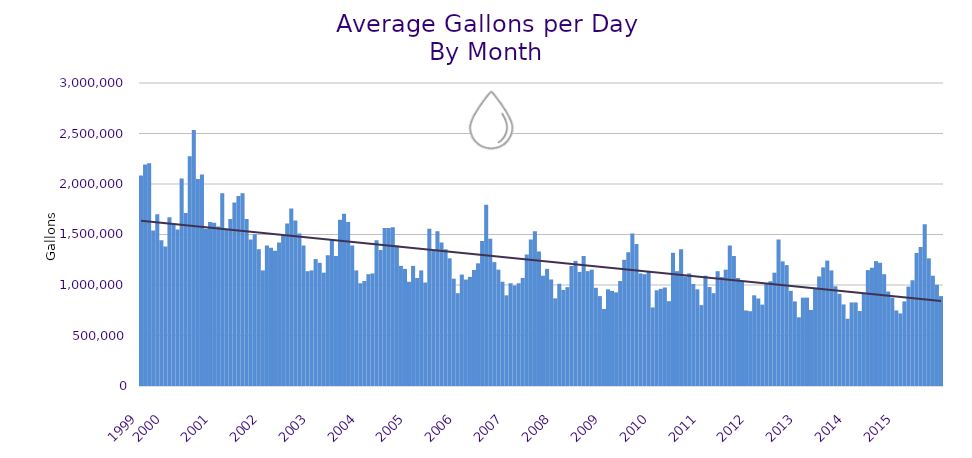
| Category | Series 0 |
|---|---|
| 1999.0 | 2083059.677 |
| nan | 2193643.161 |
| nan | 2206396.3 |
| nan | 1539362.581 |
| nan | 1699794.167 |
| nan | 1441848.323 |
| 2000.0 | 1381607.161 |
| nan | 1671325.214 |
| nan | 1605326.129 |
| nan | 1550398.467 |
| nan | 2055473.161 |
| nan | 1712920 |
| nan | 2273920 |
| nan | 2535720 |
| nan | 2049520 |
| nan | 2094400 |
| nan | 1555840 |
| nan | 1623160 |
| 2001.0 | 1615680 |
| nan | 1578280 |
| nan | 1907400 |
| nan | 1555840 |
| nan | 1653080 |
| nan | 1817640 |
| nan | 1880808.419 |
| nan | 1907400 |
| nan | 1653080 |
| nan | 1451120 |
| nan | 1503480 |
| nan | 1353880 |
| 2002.0 | 1144440 |
| nan | 1391280 |
| nan | 1368840 |
| nan | 1338920 |
| nan | 1421200 |
| nan | 1496000 |
| nan | 1608200 |
| nan | 1757800 |
| nan | 1638120 |
| nan | 1510960 |
| nan | 1391280 |
| nan | 1136960 |
| 2003.0 | 1144440 |
| nan | 1256640 |
| nan | 1219240 |
| nan | 1122000 |
| nan | 1294040 |
| nan | 1443640 |
| nan | 1286560 |
| nan | 1645600 |
| nan | 1705440 |
| nan | 1623160 |
| nan | 1391280 |
| nan | 1144440 |
| 2004.0 | 1017280 |
| nan | 1039720 |
| nan | 1107040 |
| nan | 1114520 |
| nan | 1443640 |
| nan | 1346400 |
| nan | 1563320 |
| nan | 1563320 |
| nan | 1570800 |
| nan | 1391280 |
| nan | 1189320 |
| nan | 1159400 |
| 2005.0 | 1032240 |
| nan | 1189320 |
| nan | 1069640 |
| nan | 1144440 |
| nan | 1024760 |
| nan | 1555840 |
| nan | 1338920 |
| nan | 1533400 |
| nan | 1421200 |
| nan | 1353880 |
| nan | 1264120 |
| nan | 1062160 |
| 2006.0 | 918712.194 |
| nan | 1103155.536 |
| nan | 1053757.452 |
| nan | 1080438.5 |
| nan | 1148463.71 |
| nan | 1214446 |
| nan | 1436160 |
| nan | 1795200 |
| nan | 1458600 |
| nan | 1226720 |
| nan | 1151920 |
| nan | 1032240 |
| 2007.0 | 897600 |
| nan | 1017280 |
| nan | 994840 |
| nan | 1017280 |
| nan | 1069640 |
| nan | 1301520 |
| nan | 1451120 |
| nan | 1533400 |
| nan | 1331440 |
| nan | 1092080 |
| nan | 1159400 |
| nan | 1054680 |
| 2008.0 | 867680 |
| nan | 1012531.5 |
| nan | 951152.129 |
| nan | 978536.8 |
| nan | 1188344.032 |
| nan | 1238728.733 |
| nan | 1129480 |
| nan | 1286560 |
| nan | 1136960 |
| nan | 1151920 |
| nan | 972400 |
| nan | 890120 |
| 2009.0 | 762960 |
| nan | 957440 |
| nan | 942480 |
| nan | 927520 |
| nan | 1039720 |
| nan | 1249160 |
| nan | 1323960 |
| nan | 1510960 |
| nan | 1406240 |
| nan | 1114520 |
| nan | 1107040 |
| nan | 1129480 |
| 2010.0 | 777920 |
| nan | 947745.25 |
| nan | 961719.161 |
| nan | 975173.833 |
| nan | 839375.806 |
| nan | 1320121.233 |
| nan | 1136960 |
| nan | 1353880 |
| nan | 1084600 |
| nan | 1114520 |
| nan | 1009800 |
| nan | 957440 |
| 2011.0 | 800360 |
| nan | 1092080 |
| nan | 979880 |
| nan | 919316.129 |
| nan | 1136960 |
| nan | 1078567.742 |
| nan | 1151920 |
| nan | 1391280 |
| nan | 1286560 |
| nan | 1069640 |
| nan | 1032240 |
| nan | 748000 |
| 2012.0 | 740520 |
| nan | 898004.612 |
| nan | 866524 |
| nan | 805719.677 |
| nan | 1012979 |
| nan | 1036854.677 |
| nan | 1122000 |
| nan | 1451120 |
| nan | 1234200 |
| nan | 1196800 |
| nan | 942480 |
| nan | 837760 |
| 2013.0 | 680680 |
| nan | 875160 |
| nan | 875160 |
| nan | 752825.806 |
| nan | 972400 |
| nan | 1084600 |
| nan | 1174360 |
| nan | 1241680 |
| nan | 1144440 |
| nan | 987360 |
| nan | 912560 |
| nan | 807840 |
| 2014.0 | 665720 |
| nan | 827341 |
| nan | 827106 |
| nan | 742463 |
| nan | 921589 |
| nan | 1147621 |
| nan | 1170725 |
| nan | 1236586 |
| nan | 1220152 |
| nan | 1107040 |
| nan | 935000 |
| nan | 875160 |
| 2015.0 | 748000 |
| nan | 718080 |
| nan | 837760 |
| nan | 984464.516 |
| nan | 1047200 |
| nan | 1317445.161 |
| nan | 1376320 |
| nan | 1600720 |
| nan | 1264120 |
| nan | 1092080 |
| nan | 1002320 |
| nan | 890120 |